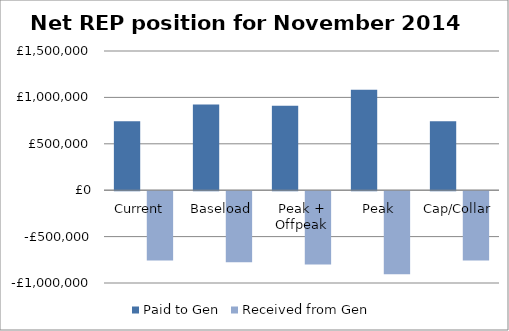
| Category | Paid to Gen | Received from Gen |
|---|---|---|
| Current  | 742961.72 | -745854.79 |
| Baseload | 924366.232 | -764980.282 |
| Peak + Offpeak | 910616.496 | -789667.563 |
| Peak | 1082767.931 | -896069.208 |
| Cap/Collar | 742819.501 | -745885.989 |